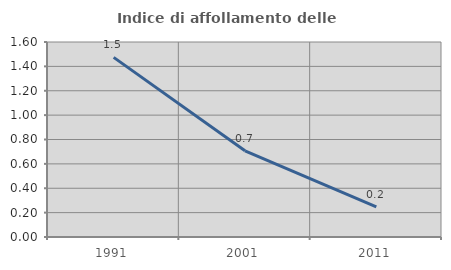
| Category | Indice di affollamento delle abitazioni  |
|---|---|
| 1991.0 | 1.474 |
| 2001.0 | 0.707 |
| 2011.0 | 0.248 |